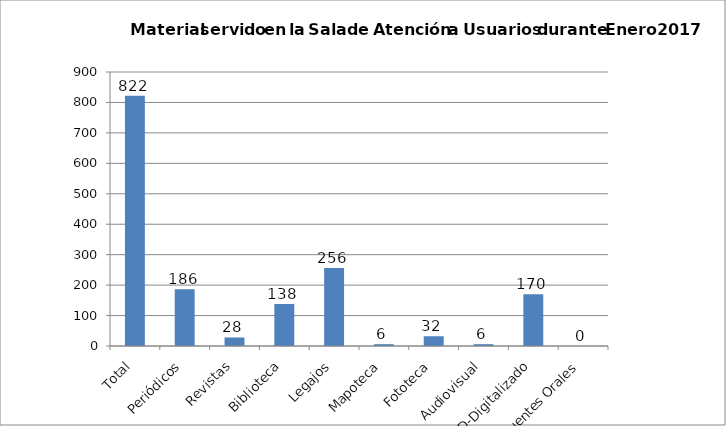
| Category | Series 0 |
|---|---|
| Total | 822 |
| Periódicos | 186 |
| Revistas | 28 |
| Biblioteca | 138 |
| Legajos | 256 |
| Mapoteca | 6 |
| Fototeca | 32 |
| Audiovisual | 6 |
| CD-Digitalizado | 170 |
| Fuentes Orales | 0 |